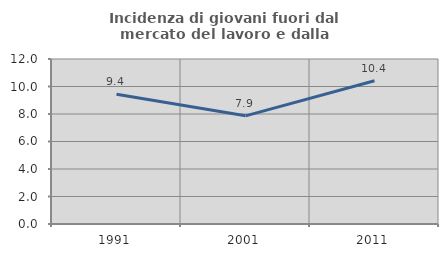
| Category | Incidenza di giovani fuori dal mercato del lavoro e dalla formazione  |
|---|---|
| 1991.0 | 9.441 |
| 2001.0 | 7.865 |
| 2011.0 | 10.417 |